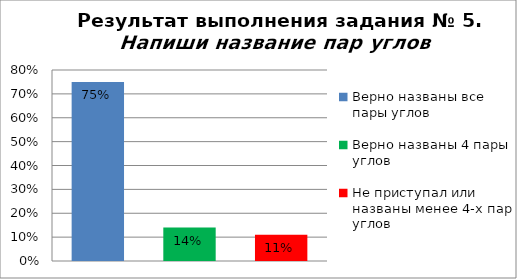
| Category | Напиши название пар углов |
|---|---|
| Верно названы все пары углов | 0.75 |
| Верно названы 4 пары углов | 0.14 |
| Не приступал или названы менее 4-х пар углов | 0.11 |